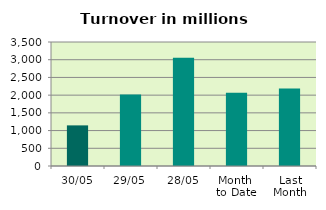
| Category | Series 0 |
|---|---|
| 30/05 | 1146.566 |
| 29/05 | 2015.036 |
| 28/05 | 3058.559 |
| Month 
to Date | 2064.545 |
| Last
Month | 2186.926 |